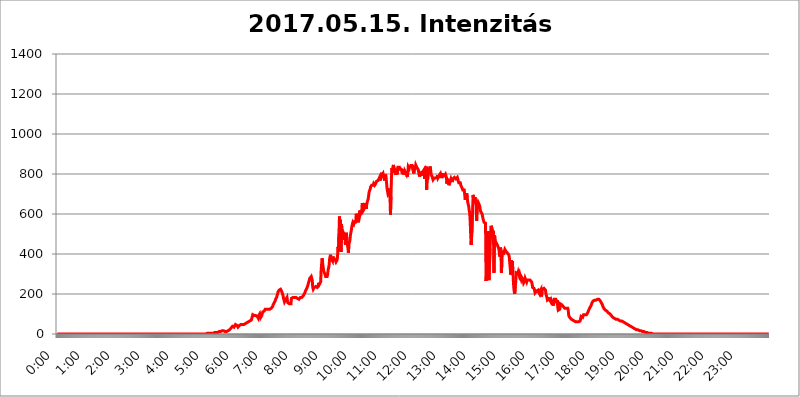
| Category | 2017.05.15. Intenzitás [W/m^2] |
|---|---|
| 0.0 | 0 |
| 0.0006944444444444445 | 0 |
| 0.001388888888888889 | 0 |
| 0.0020833333333333333 | 0 |
| 0.002777777777777778 | 0 |
| 0.003472222222222222 | 0 |
| 0.004166666666666667 | 0 |
| 0.004861111111111111 | 0 |
| 0.005555555555555556 | 0 |
| 0.0062499999999999995 | 0 |
| 0.006944444444444444 | 0 |
| 0.007638888888888889 | 0 |
| 0.008333333333333333 | 0 |
| 0.009027777777777779 | 0 |
| 0.009722222222222222 | 0 |
| 0.010416666666666666 | 0 |
| 0.011111111111111112 | 0 |
| 0.011805555555555555 | 0 |
| 0.012499999999999999 | 0 |
| 0.013194444444444444 | 0 |
| 0.013888888888888888 | 0 |
| 0.014583333333333332 | 0 |
| 0.015277777777777777 | 0 |
| 0.015972222222222224 | 0 |
| 0.016666666666666666 | 0 |
| 0.017361111111111112 | 0 |
| 0.018055555555555557 | 0 |
| 0.01875 | 0 |
| 0.019444444444444445 | 0 |
| 0.02013888888888889 | 0 |
| 0.020833333333333332 | 0 |
| 0.02152777777777778 | 0 |
| 0.022222222222222223 | 0 |
| 0.02291666666666667 | 0 |
| 0.02361111111111111 | 0 |
| 0.024305555555555556 | 0 |
| 0.024999999999999998 | 0 |
| 0.025694444444444447 | 0 |
| 0.02638888888888889 | 0 |
| 0.027083333333333334 | 0 |
| 0.027777777777777776 | 0 |
| 0.02847222222222222 | 0 |
| 0.029166666666666664 | 0 |
| 0.029861111111111113 | 0 |
| 0.030555555555555555 | 0 |
| 0.03125 | 0 |
| 0.03194444444444445 | 0 |
| 0.03263888888888889 | 0 |
| 0.03333333333333333 | 0 |
| 0.034027777777777775 | 0 |
| 0.034722222222222224 | 0 |
| 0.035416666666666666 | 0 |
| 0.036111111111111115 | 0 |
| 0.03680555555555556 | 0 |
| 0.0375 | 0 |
| 0.03819444444444444 | 0 |
| 0.03888888888888889 | 0 |
| 0.03958333333333333 | 0 |
| 0.04027777777777778 | 0 |
| 0.04097222222222222 | 0 |
| 0.041666666666666664 | 0 |
| 0.042361111111111106 | 0 |
| 0.04305555555555556 | 0 |
| 0.043750000000000004 | 0 |
| 0.044444444444444446 | 0 |
| 0.04513888888888889 | 0 |
| 0.04583333333333334 | 0 |
| 0.04652777777777778 | 0 |
| 0.04722222222222222 | 0 |
| 0.04791666666666666 | 0 |
| 0.04861111111111111 | 0 |
| 0.049305555555555554 | 0 |
| 0.049999999999999996 | 0 |
| 0.05069444444444445 | 0 |
| 0.051388888888888894 | 0 |
| 0.052083333333333336 | 0 |
| 0.05277777777777778 | 0 |
| 0.05347222222222222 | 0 |
| 0.05416666666666667 | 0 |
| 0.05486111111111111 | 0 |
| 0.05555555555555555 | 0 |
| 0.05625 | 0 |
| 0.05694444444444444 | 0 |
| 0.057638888888888885 | 0 |
| 0.05833333333333333 | 0 |
| 0.05902777777777778 | 0 |
| 0.059722222222222225 | 0 |
| 0.06041666666666667 | 0 |
| 0.061111111111111116 | 0 |
| 0.06180555555555556 | 0 |
| 0.0625 | 0 |
| 0.06319444444444444 | 0 |
| 0.06388888888888888 | 0 |
| 0.06458333333333334 | 0 |
| 0.06527777777777778 | 0 |
| 0.06597222222222222 | 0 |
| 0.06666666666666667 | 0 |
| 0.06736111111111111 | 0 |
| 0.06805555555555555 | 0 |
| 0.06874999999999999 | 0 |
| 0.06944444444444443 | 0 |
| 0.07013888888888889 | 0 |
| 0.07083333333333333 | 0 |
| 0.07152777777777779 | 0 |
| 0.07222222222222223 | 0 |
| 0.07291666666666667 | 0 |
| 0.07361111111111111 | 0 |
| 0.07430555555555556 | 0 |
| 0.075 | 0 |
| 0.07569444444444444 | 0 |
| 0.0763888888888889 | 0 |
| 0.07708333333333334 | 0 |
| 0.07777777777777778 | 0 |
| 0.07847222222222222 | 0 |
| 0.07916666666666666 | 0 |
| 0.0798611111111111 | 0 |
| 0.08055555555555556 | 0 |
| 0.08125 | 0 |
| 0.08194444444444444 | 0 |
| 0.08263888888888889 | 0 |
| 0.08333333333333333 | 0 |
| 0.08402777777777777 | 0 |
| 0.08472222222222221 | 0 |
| 0.08541666666666665 | 0 |
| 0.08611111111111112 | 0 |
| 0.08680555555555557 | 0 |
| 0.08750000000000001 | 0 |
| 0.08819444444444445 | 0 |
| 0.08888888888888889 | 0 |
| 0.08958333333333333 | 0 |
| 0.09027777777777778 | 0 |
| 0.09097222222222222 | 0 |
| 0.09166666666666667 | 0 |
| 0.09236111111111112 | 0 |
| 0.09305555555555556 | 0 |
| 0.09375 | 0 |
| 0.09444444444444444 | 0 |
| 0.09513888888888888 | 0 |
| 0.09583333333333333 | 0 |
| 0.09652777777777777 | 0 |
| 0.09722222222222222 | 0 |
| 0.09791666666666667 | 0 |
| 0.09861111111111111 | 0 |
| 0.09930555555555555 | 0 |
| 0.09999999999999999 | 0 |
| 0.10069444444444443 | 0 |
| 0.1013888888888889 | 0 |
| 0.10208333333333335 | 0 |
| 0.10277777777777779 | 0 |
| 0.10347222222222223 | 0 |
| 0.10416666666666667 | 0 |
| 0.10486111111111111 | 0 |
| 0.10555555555555556 | 0 |
| 0.10625 | 0 |
| 0.10694444444444444 | 0 |
| 0.1076388888888889 | 0 |
| 0.10833333333333334 | 0 |
| 0.10902777777777778 | 0 |
| 0.10972222222222222 | 0 |
| 0.1111111111111111 | 0 |
| 0.11180555555555556 | 0 |
| 0.11180555555555556 | 0 |
| 0.1125 | 0 |
| 0.11319444444444444 | 0 |
| 0.11388888888888889 | 0 |
| 0.11458333333333333 | 0 |
| 0.11527777777777777 | 0 |
| 0.11597222222222221 | 0 |
| 0.11666666666666665 | 0 |
| 0.1173611111111111 | 0 |
| 0.11805555555555557 | 0 |
| 0.11944444444444445 | 0 |
| 0.12013888888888889 | 0 |
| 0.12083333333333333 | 0 |
| 0.12152777777777778 | 0 |
| 0.12222222222222223 | 0 |
| 0.12291666666666667 | 0 |
| 0.12291666666666667 | 0 |
| 0.12361111111111112 | 0 |
| 0.12430555555555556 | 0 |
| 0.125 | 0 |
| 0.12569444444444444 | 0 |
| 0.12638888888888888 | 0 |
| 0.12708333333333333 | 0 |
| 0.16875 | 0 |
| 0.12847222222222224 | 0 |
| 0.12916666666666668 | 0 |
| 0.12986111111111112 | 0 |
| 0.13055555555555556 | 0 |
| 0.13125 | 0 |
| 0.13194444444444445 | 0 |
| 0.1326388888888889 | 0 |
| 0.13333333333333333 | 0 |
| 0.13402777777777777 | 0 |
| 0.13402777777777777 | 0 |
| 0.13472222222222222 | 0 |
| 0.13541666666666666 | 0 |
| 0.1361111111111111 | 0 |
| 0.13749999999999998 | 0 |
| 0.13819444444444443 | 0 |
| 0.1388888888888889 | 0 |
| 0.13958333333333334 | 0 |
| 0.14027777777777778 | 0 |
| 0.14097222222222222 | 0 |
| 0.14166666666666666 | 0 |
| 0.1423611111111111 | 0 |
| 0.14305555555555557 | 0 |
| 0.14375000000000002 | 0 |
| 0.14444444444444446 | 0 |
| 0.1451388888888889 | 0 |
| 0.1451388888888889 | 0 |
| 0.14652777777777778 | 0 |
| 0.14722222222222223 | 0 |
| 0.14791666666666667 | 0 |
| 0.1486111111111111 | 0 |
| 0.14930555555555555 | 0 |
| 0.15 | 0 |
| 0.15069444444444444 | 0 |
| 0.15138888888888888 | 0 |
| 0.15208333333333332 | 0 |
| 0.15277777777777776 | 0 |
| 0.15347222222222223 | 0 |
| 0.15416666666666667 | 0 |
| 0.15486111111111112 | 0 |
| 0.15555555555555556 | 0 |
| 0.15625 | 0 |
| 0.15694444444444444 | 0 |
| 0.15763888888888888 | 0 |
| 0.15833333333333333 | 0 |
| 0.15902777777777777 | 0 |
| 0.15972222222222224 | 0 |
| 0.16041666666666668 | 0 |
| 0.16111111111111112 | 0 |
| 0.16180555555555556 | 0 |
| 0.1625 | 0 |
| 0.16319444444444445 | 0 |
| 0.1638888888888889 | 0 |
| 0.16458333333333333 | 0 |
| 0.16527777777777777 | 0 |
| 0.16597222222222222 | 0 |
| 0.16666666666666666 | 0 |
| 0.1673611111111111 | 0 |
| 0.16805555555555554 | 0 |
| 0.16874999999999998 | 0 |
| 0.16944444444444443 | 0 |
| 0.17013888888888887 | 0 |
| 0.1708333333333333 | 0 |
| 0.17152777777777775 | 0 |
| 0.17222222222222225 | 0 |
| 0.1729166666666667 | 0 |
| 0.17361111111111113 | 0 |
| 0.17430555555555557 | 0 |
| 0.17500000000000002 | 0 |
| 0.17569444444444446 | 0 |
| 0.1763888888888889 | 0 |
| 0.17708333333333334 | 0 |
| 0.17777777777777778 | 0 |
| 0.17847222222222223 | 0 |
| 0.17916666666666667 | 0 |
| 0.1798611111111111 | 0 |
| 0.18055555555555555 | 0 |
| 0.18125 | 0 |
| 0.18194444444444444 | 0 |
| 0.1826388888888889 | 0 |
| 0.18333333333333335 | 0 |
| 0.1840277777777778 | 0 |
| 0.18472222222222223 | 0 |
| 0.18541666666666667 | 0 |
| 0.18611111111111112 | 0 |
| 0.18680555555555556 | 0 |
| 0.1875 | 0 |
| 0.18819444444444444 | 0 |
| 0.18888888888888888 | 0 |
| 0.18958333333333333 | 0 |
| 0.19027777777777777 | 0 |
| 0.1909722222222222 | 0 |
| 0.19166666666666665 | 0 |
| 0.19236111111111112 | 0 |
| 0.19305555555555554 | 0 |
| 0.19375 | 0 |
| 0.19444444444444445 | 0 |
| 0.1951388888888889 | 0 |
| 0.19583333333333333 | 0 |
| 0.19652777777777777 | 0 |
| 0.19722222222222222 | 0 |
| 0.19791666666666666 | 0 |
| 0.1986111111111111 | 0 |
| 0.19930555555555554 | 0 |
| 0.19999999999999998 | 0 |
| 0.20069444444444443 | 0 |
| 0.20138888888888887 | 0 |
| 0.2020833333333333 | 0 |
| 0.2027777777777778 | 0 |
| 0.2034722222222222 | 0 |
| 0.2041666666666667 | 0 |
| 0.20486111111111113 | 0 |
| 0.20555555555555557 | 0 |
| 0.20625000000000002 | 0 |
| 0.20694444444444446 | 0 |
| 0.2076388888888889 | 0 |
| 0.20833333333333334 | 0 |
| 0.20902777777777778 | 3.525 |
| 0.20972222222222223 | 3.525 |
| 0.21041666666666667 | 3.525 |
| 0.2111111111111111 | 3.525 |
| 0.21180555555555555 | 3.525 |
| 0.2125 | 3.525 |
| 0.21319444444444444 | 3.525 |
| 0.2138888888888889 | 3.525 |
| 0.21458333333333335 | 3.525 |
| 0.2152777777777778 | 3.525 |
| 0.21597222222222223 | 3.525 |
| 0.21666666666666667 | 3.525 |
| 0.21736111111111112 | 3.525 |
| 0.21805555555555556 | 3.525 |
| 0.21875 | 3.525 |
| 0.21944444444444444 | 7.887 |
| 0.22013888888888888 | 7.887 |
| 0.22083333333333333 | 7.887 |
| 0.22152777777777777 | 7.887 |
| 0.2222222222222222 | 7.887 |
| 0.22291666666666665 | 7.887 |
| 0.2236111111111111 | 7.887 |
| 0.22430555555555556 | 7.887 |
| 0.225 | 7.887 |
| 0.22569444444444445 | 7.887 |
| 0.2263888888888889 | 12.257 |
| 0.22708333333333333 | 12.257 |
| 0.22777777777777777 | 12.257 |
| 0.22847222222222222 | 12.257 |
| 0.22916666666666666 | 12.257 |
| 0.2298611111111111 | 16.636 |
| 0.23055555555555554 | 16.636 |
| 0.23124999999999998 | 16.636 |
| 0.23194444444444443 | 16.636 |
| 0.23263888888888887 | 16.636 |
| 0.2333333333333333 | 16.636 |
| 0.2340277777777778 | 16.636 |
| 0.2347222222222222 | 12.257 |
| 0.2354166666666667 | 12.257 |
| 0.23611111111111113 | 12.257 |
| 0.23680555555555557 | 12.257 |
| 0.23750000000000002 | 12.257 |
| 0.23819444444444446 | 12.257 |
| 0.2388888888888889 | 16.636 |
| 0.23958333333333334 | 16.636 |
| 0.24027777777777778 | 16.636 |
| 0.24097222222222223 | 21.024 |
| 0.24166666666666667 | 21.024 |
| 0.2423611111111111 | 25.419 |
| 0.24305555555555555 | 25.419 |
| 0.24375 | 29.823 |
| 0.24444444444444446 | 29.823 |
| 0.24513888888888888 | 34.234 |
| 0.24583333333333335 | 38.653 |
| 0.2465277777777778 | 34.234 |
| 0.24722222222222223 | 34.234 |
| 0.24791666666666667 | 34.234 |
| 0.24861111111111112 | 34.234 |
| 0.24930555555555556 | 38.653 |
| 0.25 | 47.511 |
| 0.25069444444444444 | 47.511 |
| 0.2513888888888889 | 47.511 |
| 0.2520833333333333 | 43.079 |
| 0.25277777777777777 | 38.653 |
| 0.2534722222222222 | 34.234 |
| 0.25416666666666665 | 38.653 |
| 0.2548611111111111 | 38.653 |
| 0.2555555555555556 | 43.079 |
| 0.25625000000000003 | 47.511 |
| 0.2569444444444445 | 47.511 |
| 0.2576388888888889 | 47.511 |
| 0.25833333333333336 | 47.511 |
| 0.2590277777777778 | 47.511 |
| 0.25972222222222224 | 47.511 |
| 0.2604166666666667 | 47.511 |
| 0.2611111111111111 | 47.511 |
| 0.26180555555555557 | 47.511 |
| 0.2625 | 47.511 |
| 0.26319444444444445 | 51.951 |
| 0.2638888888888889 | 51.951 |
| 0.26458333333333334 | 51.951 |
| 0.2652777777777778 | 51.951 |
| 0.2659722222222222 | 56.398 |
| 0.26666666666666666 | 56.398 |
| 0.2673611111111111 | 56.398 |
| 0.26805555555555555 | 60.85 |
| 0.26875 | 60.85 |
| 0.26944444444444443 | 65.31 |
| 0.2701388888888889 | 65.31 |
| 0.2708333333333333 | 69.775 |
| 0.27152777777777776 | 69.775 |
| 0.2722222222222222 | 69.775 |
| 0.27291666666666664 | 69.775 |
| 0.2736111111111111 | 87.692 |
| 0.2743055555555555 | 96.682 |
| 0.27499999999999997 | 92.184 |
| 0.27569444444444446 | 96.682 |
| 0.27638888888888885 | 92.184 |
| 0.27708333333333335 | 92.184 |
| 0.2777777777777778 | 92.184 |
| 0.27847222222222223 | 92.184 |
| 0.2791666666666667 | 92.184 |
| 0.2798611111111111 | 96.682 |
| 0.28055555555555556 | 87.692 |
| 0.28125 | 92.184 |
| 0.28194444444444444 | 78.722 |
| 0.2826388888888889 | 92.184 |
| 0.2833333333333333 | 96.682 |
| 0.28402777777777777 | 101.184 |
| 0.2847222222222222 | 96.682 |
| 0.28541666666666665 | 83.205 |
| 0.28611111111111115 | 83.205 |
| 0.28680555555555554 | 92.184 |
| 0.28750000000000003 | 101.184 |
| 0.2881944444444445 | 110.201 |
| 0.2888888888888889 | 110.201 |
| 0.28958333333333336 | 114.716 |
| 0.2902777777777778 | 114.716 |
| 0.29097222222222224 | 119.235 |
| 0.2916666666666667 | 123.758 |
| 0.2923611111111111 | 123.758 |
| 0.29305555555555557 | 123.758 |
| 0.29375 | 123.758 |
| 0.29444444444444445 | 123.758 |
| 0.2951388888888889 | 123.758 |
| 0.29583333333333334 | 123.758 |
| 0.2965277777777778 | 123.758 |
| 0.2972222222222222 | 123.758 |
| 0.29791666666666666 | 123.758 |
| 0.2986111111111111 | 123.758 |
| 0.29930555555555555 | 128.284 |
| 0.3 | 128.284 |
| 0.30069444444444443 | 128.284 |
| 0.3013888888888889 | 132.814 |
| 0.3020833333333333 | 137.347 |
| 0.30277777777777776 | 146.423 |
| 0.3034722222222222 | 150.964 |
| 0.30416666666666664 | 155.509 |
| 0.3048611111111111 | 160.056 |
| 0.3055555555555555 | 164.605 |
| 0.30624999999999997 | 173.709 |
| 0.3069444444444444 | 178.264 |
| 0.3076388888888889 | 182.82 |
| 0.30833333333333335 | 191.937 |
| 0.3090277777777778 | 201.058 |
| 0.30972222222222223 | 210.182 |
| 0.3104166666666667 | 214.746 |
| 0.3111111111111111 | 219.309 |
| 0.31180555555555556 | 219.309 |
| 0.3125 | 223.873 |
| 0.31319444444444444 | 223.873 |
| 0.3138888888888889 | 219.309 |
| 0.3145833333333333 | 214.746 |
| 0.31527777777777777 | 210.182 |
| 0.3159722222222222 | 201.058 |
| 0.31666666666666665 | 191.937 |
| 0.31736111111111115 | 178.264 |
| 0.31805555555555554 | 178.264 |
| 0.31875000000000003 | 160.056 |
| 0.3194444444444445 | 160.056 |
| 0.3201388888888889 | 164.605 |
| 0.32083333333333336 | 173.709 |
| 0.3215277777777778 | 173.709 |
| 0.32222222222222224 | 182.82 |
| 0.3229166666666667 | 164.605 |
| 0.3236111111111111 | 155.509 |
| 0.32430555555555557 | 150.964 |
| 0.325 | 150.964 |
| 0.32569444444444445 | 150.964 |
| 0.3263888888888889 | 146.423 |
| 0.32708333333333334 | 146.423 |
| 0.3277777777777778 | 150.964 |
| 0.3284722222222222 | 178.264 |
| 0.32916666666666666 | 182.82 |
| 0.3298611111111111 | 182.82 |
| 0.33055555555555555 | 182.82 |
| 0.33125 | 182.82 |
| 0.33194444444444443 | 182.82 |
| 0.3326388888888889 | 182.82 |
| 0.3333333333333333 | 182.82 |
| 0.3340277777777778 | 182.82 |
| 0.3347222222222222 | 182.82 |
| 0.3354166666666667 | 182.82 |
| 0.3361111111111111 | 182.82 |
| 0.3368055555555556 | 178.264 |
| 0.33749999999999997 | 178.264 |
| 0.33819444444444446 | 178.264 |
| 0.33888888888888885 | 173.709 |
| 0.33958333333333335 | 178.264 |
| 0.34027777777777773 | 178.264 |
| 0.34097222222222223 | 182.82 |
| 0.3416666666666666 | 182.82 |
| 0.3423611111111111 | 182.82 |
| 0.3430555555555555 | 182.82 |
| 0.34375 | 182.82 |
| 0.3444444444444445 | 187.378 |
| 0.3451388888888889 | 191.937 |
| 0.3458333333333334 | 196.497 |
| 0.34652777777777777 | 196.497 |
| 0.34722222222222227 | 205.62 |
| 0.34791666666666665 | 210.182 |
| 0.34861111111111115 | 219.309 |
| 0.34930555555555554 | 223.873 |
| 0.35000000000000003 | 228.436 |
| 0.3506944444444444 | 233 |
| 0.3513888888888889 | 242.127 |
| 0.3520833333333333 | 251.251 |
| 0.3527777777777778 | 260.373 |
| 0.3534722222222222 | 269.49 |
| 0.3541666666666667 | 278.603 |
| 0.3548611111111111 | 283.156 |
| 0.35555555555555557 | 283.156 |
| 0.35625 | 287.709 |
| 0.35694444444444445 | 292.259 |
| 0.3576388888888889 | 269.49 |
| 0.35833333333333334 | 233 |
| 0.3590277777777778 | 223.873 |
| 0.3597222222222222 | 228.436 |
| 0.36041666666666666 | 233 |
| 0.3611111111111111 | 237.564 |
| 0.36180555555555555 | 237.564 |
| 0.3625 | 237.564 |
| 0.36319444444444443 | 233 |
| 0.3638888888888889 | 233 |
| 0.3645833333333333 | 233 |
| 0.3652777777777778 | 237.564 |
| 0.3659722222222222 | 242.127 |
| 0.3666666666666667 | 255.813 |
| 0.3673611111111111 | 246.689 |
| 0.3680555555555556 | 246.689 |
| 0.36874999999999997 | 251.251 |
| 0.36944444444444446 | 260.373 |
| 0.37013888888888885 | 319.517 |
| 0.37083333333333335 | 351.198 |
| 0.37152777777777773 | 378.224 |
| 0.37222222222222223 | 355.712 |
| 0.3729166666666666 | 351.198 |
| 0.3736111111111111 | 314.98 |
| 0.3743055555555555 | 310.44 |
| 0.375 | 319.517 |
| 0.3756944444444445 | 296.808 |
| 0.3763888888888889 | 287.709 |
| 0.3770833333333334 | 283.156 |
| 0.37777777777777777 | 283.156 |
| 0.37847222222222227 | 287.709 |
| 0.37916666666666665 | 296.808 |
| 0.37986111111111115 | 319.517 |
| 0.38055555555555554 | 324.052 |
| 0.38125000000000003 | 342.162 |
| 0.3819444444444444 | 373.729 |
| 0.3826388888888889 | 387.202 |
| 0.3833333333333333 | 396.164 |
| 0.3840277777777778 | 378.224 |
| 0.3847222222222222 | 378.224 |
| 0.3854166666666667 | 373.729 |
| 0.3861111111111111 | 364.728 |
| 0.38680555555555557 | 387.202 |
| 0.3875 | 378.224 |
| 0.38819444444444445 | 378.224 |
| 0.3888888888888889 | 373.729 |
| 0.38958333333333334 | 373.729 |
| 0.3902777777777778 | 369.23 |
| 0.3909722222222222 | 360.221 |
| 0.39166666666666666 | 360.221 |
| 0.3923611111111111 | 369.23 |
| 0.39305555555555555 | 382.715 |
| 0.39375 | 436.27 |
| 0.39444444444444443 | 418.492 |
| 0.3951388888888889 | 502.192 |
| 0.3958333333333333 | 588.009 |
| 0.3965277777777778 | 515.223 |
| 0.3972222222222222 | 571.049 |
| 0.3979166666666667 | 409.574 |
| 0.3986111111111111 | 549.704 |
| 0.3993055555555556 | 519.555 |
| 0.39999999999999997 | 471.582 |
| 0.40069444444444446 | 471.582 |
| 0.40138888888888885 | 506.542 |
| 0.40208333333333335 | 510.885 |
| 0.40277777777777773 | 497.836 |
| 0.40347222222222223 | 489.108 |
| 0.4041666666666666 | 445.129 |
| 0.4048611111111111 | 484.735 |
| 0.4055555555555555 | 506.542 |
| 0.40625 | 458.38 |
| 0.4069444444444445 | 453.968 |
| 0.4076388888888889 | 431.833 |
| 0.4083333333333334 | 405.108 |
| 0.40902777777777777 | 449.551 |
| 0.40972222222222227 | 445.129 |
| 0.41041666666666665 | 467.187 |
| 0.41111111111111115 | 493.475 |
| 0.41180555555555554 | 493.475 |
| 0.41250000000000003 | 519.555 |
| 0.4131944444444444 | 536.82 |
| 0.4138888888888889 | 549.704 |
| 0.4145833333333333 | 558.261 |
| 0.4152777777777778 | 553.986 |
| 0.4159722222222222 | 549.704 |
| 0.4166666666666667 | 549.704 |
| 0.4173611111111111 | 566.793 |
| 0.41805555555555557 | 553.986 |
| 0.41875 | 566.793 |
| 0.41944444444444445 | 600.661 |
| 0.4201388888888889 | 562.53 |
| 0.42083333333333334 | 600.661 |
| 0.4215277777777778 | 566.793 |
| 0.4222222222222222 | 558.261 |
| 0.42291666666666666 | 571.049 |
| 0.4236111111111111 | 579.542 |
| 0.42430555555555555 | 617.436 |
| 0.425 | 596.45 |
| 0.42569444444444443 | 600.661 |
| 0.4263888888888889 | 600.661 |
| 0.4270833333333333 | 613.252 |
| 0.4277777777777778 | 654.791 |
| 0.4284722222222222 | 642.4 |
| 0.4291666666666667 | 617.436 |
| 0.4298611111111111 | 613.252 |
| 0.4305555555555556 | 625.784 |
| 0.43124999999999997 | 629.948 |
| 0.43194444444444446 | 654.791 |
| 0.43263888888888885 | 650.667 |
| 0.43333333333333335 | 625.784 |
| 0.43402777777777773 | 650.667 |
| 0.43472222222222223 | 658.909 |
| 0.4354166666666666 | 667.123 |
| 0.4361111111111111 | 675.311 |
| 0.4368055555555555 | 679.395 |
| 0.4375 | 711.832 |
| 0.4381944444444445 | 715.858 |
| 0.4388888888888889 | 723.889 |
| 0.4395833333333334 | 735.89 |
| 0.44027777777777777 | 735.89 |
| 0.44097222222222227 | 743.859 |
| 0.44166666666666665 | 739.877 |
| 0.44236111111111115 | 747.834 |
| 0.44305555555555554 | 743.859 |
| 0.44375000000000003 | 751.803 |
| 0.4444444444444444 | 747.834 |
| 0.4451388888888889 | 743.859 |
| 0.4458333333333333 | 747.834 |
| 0.4465277777777778 | 751.803 |
| 0.4472222222222222 | 755.766 |
| 0.4479166666666667 | 763.674 |
| 0.4486111111111111 | 763.674 |
| 0.44930555555555557 | 759.723 |
| 0.45 | 767.62 |
| 0.45069444444444445 | 771.559 |
| 0.4513888888888889 | 771.559 |
| 0.45208333333333334 | 783.342 |
| 0.4527777777777778 | 767.62 |
| 0.4534722222222222 | 763.674 |
| 0.45416666666666666 | 787.258 |
| 0.4548611111111111 | 806.757 |
| 0.45555555555555555 | 795.074 |
| 0.45625 | 791.169 |
| 0.45694444444444443 | 802.868 |
| 0.4576388888888889 | 806.757 |
| 0.4583333333333333 | 806.757 |
| 0.4590277777777778 | 767.62 |
| 0.4597222222222222 | 798.974 |
| 0.4604166666666667 | 798.974 |
| 0.4611111111111111 | 787.258 |
| 0.4618055555555556 | 759.723 |
| 0.46249999999999997 | 727.896 |
| 0.46319444444444446 | 727.896 |
| 0.46388888888888885 | 699.717 |
| 0.46458333333333335 | 703.762 |
| 0.46527777777777773 | 707.8 |
| 0.46597222222222223 | 727.896 |
| 0.4666666666666666 | 683.473 |
| 0.4673611111111111 | 596.45 |
| 0.4680555555555555 | 687.544 |
| 0.46875 | 783.342 |
| 0.4694444444444445 | 829.981 |
| 0.4701388888888889 | 806.757 |
| 0.4708333333333334 | 810.641 |
| 0.47152777777777777 | 845.365 |
| 0.47222222222222227 | 829.981 |
| 0.47291666666666665 | 826.123 |
| 0.47361111111111115 | 822.26 |
| 0.47430555555555554 | 810.641 |
| 0.47500000000000003 | 795.074 |
| 0.4756944444444444 | 822.26 |
| 0.4763888888888889 | 826.123 |
| 0.4770833333333333 | 798.974 |
| 0.4777777777777778 | 833.834 |
| 0.4784722222222222 | 829.981 |
| 0.4791666666666667 | 829.981 |
| 0.4798611111111111 | 833.834 |
| 0.48055555555555557 | 822.26 |
| 0.48125 | 829.981 |
| 0.48194444444444445 | 818.392 |
| 0.4826388888888889 | 826.123 |
| 0.48333333333333334 | 814.519 |
| 0.4840277777777778 | 798.974 |
| 0.4847222222222222 | 802.868 |
| 0.48541666666666666 | 814.519 |
| 0.4861111111111111 | 822.26 |
| 0.48680555555555555 | 795.074 |
| 0.4875 | 814.519 |
| 0.48819444444444443 | 814.519 |
| 0.4888888888888889 | 810.641 |
| 0.4895833333333333 | 798.974 |
| 0.4902777777777778 | 814.519 |
| 0.4909722222222222 | 787.258 |
| 0.4916666666666667 | 802.868 |
| 0.4923611111111111 | 837.682 |
| 0.4930555555555556 | 833.834 |
| 0.49374999999999997 | 829.981 |
| 0.49444444444444446 | 841.526 |
| 0.49513888888888885 | 829.981 |
| 0.49583333333333335 | 837.682 |
| 0.49652777777777773 | 849.199 |
| 0.49722222222222223 | 837.682 |
| 0.4979166666666666 | 845.365 |
| 0.4986111111111111 | 845.365 |
| 0.4993055555555555 | 841.526 |
| 0.5 | 802.868 |
| 0.5006944444444444 | 818.392 |
| 0.5013888888888889 | 818.392 |
| 0.5020833333333333 | 829.981 |
| 0.5027777777777778 | 845.365 |
| 0.5034722222222222 | 845.365 |
| 0.5041666666666667 | 833.834 |
| 0.5048611111111111 | 833.834 |
| 0.5055555555555555 | 829.981 |
| 0.50625 | 822.26 |
| 0.5069444444444444 | 818.392 |
| 0.5076388888888889 | 795.074 |
| 0.5083333333333333 | 787.258 |
| 0.5090277777777777 | 791.169 |
| 0.5097222222222222 | 810.641 |
| 0.5104166666666666 | 791.169 |
| 0.5111111111111112 | 806.757 |
| 0.5118055555555555 | 814.519 |
| 0.5125000000000001 | 798.974 |
| 0.5131944444444444 | 814.519 |
| 0.513888888888889 | 810.641 |
| 0.5145833333333333 | 822.26 |
| 0.5152777777777778 | 775.492 |
| 0.5159722222222222 | 814.519 |
| 0.5166666666666667 | 810.641 |
| 0.517361111111111 | 837.682 |
| 0.5180555555555556 | 719.877 |
| 0.5187499999999999 | 787.258 |
| 0.5194444444444445 | 771.559 |
| 0.5201388888888888 | 767.62 |
| 0.5208333333333334 | 829.981 |
| 0.5215277777777778 | 810.641 |
| 0.5222222222222223 | 829.981 |
| 0.5229166666666667 | 837.682 |
| 0.5236111111111111 | 822.26 |
| 0.5243055555555556 | 798.974 |
| 0.525 | 802.868 |
| 0.5256944444444445 | 787.258 |
| 0.5263888888888889 | 783.342 |
| 0.5270833333333333 | 771.559 |
| 0.5277777777777778 | 767.62 |
| 0.5284722222222222 | 779.42 |
| 0.5291666666666667 | 783.342 |
| 0.5298611111111111 | 775.492 |
| 0.5305555555555556 | 779.42 |
| 0.53125 | 775.492 |
| 0.5319444444444444 | 783.342 |
| 0.5326388888888889 | 783.342 |
| 0.5333333333333333 | 795.074 |
| 0.5340277777777778 | 779.42 |
| 0.5347222222222222 | 779.42 |
| 0.5354166666666667 | 787.258 |
| 0.5361111111111111 | 795.074 |
| 0.5368055555555555 | 791.169 |
| 0.5375 | 802.868 |
| 0.5381944444444444 | 795.074 |
| 0.5388888888888889 | 795.074 |
| 0.5395833333333333 | 779.42 |
| 0.5402777777777777 | 802.868 |
| 0.5409722222222222 | 795.074 |
| 0.5416666666666666 | 791.169 |
| 0.5423611111111112 | 791.169 |
| 0.5430555555555555 | 791.169 |
| 0.5437500000000001 | 795.074 |
| 0.5444444444444444 | 798.974 |
| 0.545138888888889 | 791.169 |
| 0.5458333333333333 | 783.342 |
| 0.5465277777777778 | 751.803 |
| 0.5472222222222222 | 775.492 |
| 0.5479166666666667 | 779.42 |
| 0.548611111111111 | 763.674 |
| 0.5493055555555556 | 743.859 |
| 0.5499999999999999 | 747.834 |
| 0.5506944444444445 | 747.834 |
| 0.5513888888888888 | 767.62 |
| 0.5520833333333334 | 775.492 |
| 0.5527777777777778 | 767.62 |
| 0.5534722222222223 | 779.42 |
| 0.5541666666666667 | 759.723 |
| 0.5548611111111111 | 775.492 |
| 0.5555555555555556 | 779.42 |
| 0.55625 | 779.42 |
| 0.5569444444444445 | 783.342 |
| 0.5576388888888889 | 783.342 |
| 0.5583333333333333 | 783.342 |
| 0.5590277777777778 | 775.492 |
| 0.5597222222222222 | 779.42 |
| 0.5604166666666667 | 775.492 |
| 0.5611111111111111 | 783.342 |
| 0.5618055555555556 | 775.492 |
| 0.5625 | 763.674 |
| 0.5631944444444444 | 755.766 |
| 0.5638888888888889 | 759.723 |
| 0.5645833333333333 | 759.723 |
| 0.5652777777777778 | 755.766 |
| 0.5659722222222222 | 743.859 |
| 0.5666666666666667 | 743.859 |
| 0.5673611111111111 | 739.877 |
| 0.5680555555555555 | 727.896 |
| 0.56875 | 719.877 |
| 0.5694444444444444 | 719.877 |
| 0.5701388888888889 | 723.889 |
| 0.5708333333333333 | 719.877 |
| 0.5715277777777777 | 715.858 |
| 0.5722222222222222 | 671.22 |
| 0.5729166666666666 | 687.544 |
| 0.5736111111111112 | 691.608 |
| 0.5743055555555555 | 703.762 |
| 0.5750000000000001 | 683.473 |
| 0.5756944444444444 | 658.909 |
| 0.576388888888889 | 663.019 |
| 0.5770833333333333 | 638.256 |
| 0.5777777777777778 | 617.436 |
| 0.5784722222222222 | 604.864 |
| 0.5791666666666667 | 562.53 |
| 0.579861111111111 | 497.836 |
| 0.5805555555555556 | 445.129 |
| 0.5812499999999999 | 493.475 |
| 0.5819444444444445 | 515.223 |
| 0.5826388888888888 | 634.105 |
| 0.5833333333333334 | 695.666 |
| 0.5840277777777778 | 663.019 |
| 0.5847222222222223 | 654.791 |
| 0.5854166666666667 | 667.123 |
| 0.5861111111111111 | 683.473 |
| 0.5868055555555556 | 654.791 |
| 0.5875 | 642.4 |
| 0.5881944444444445 | 566.793 |
| 0.5888888888888889 | 634.105 |
| 0.5895833333333333 | 650.667 |
| 0.5902777777777778 | 658.909 |
| 0.5909722222222222 | 654.791 |
| 0.5916666666666667 | 654.791 |
| 0.5923611111111111 | 642.4 |
| 0.5930555555555556 | 638.256 |
| 0.59375 | 613.252 |
| 0.5944444444444444 | 609.062 |
| 0.5951388888888889 | 609.062 |
| 0.5958333333333333 | 600.661 |
| 0.5965277777777778 | 596.45 |
| 0.5972222222222222 | 575.299 |
| 0.5979166666666667 | 579.542 |
| 0.5986111111111111 | 558.261 |
| 0.5993055555555555 | 553.986 |
| 0.6 | 562.53 |
| 0.6006944444444444 | 553.986 |
| 0.6013888888888889 | 264.932 |
| 0.6020833333333333 | 296.808 |
| 0.6027777777777777 | 269.49 |
| 0.6034722222222222 | 337.639 |
| 0.6041666666666666 | 515.223 |
| 0.6048611111111112 | 310.44 |
| 0.6055555555555555 | 269.49 |
| 0.6062500000000001 | 264.932 |
| 0.6069444444444444 | 427.39 |
| 0.607638888888889 | 484.735 |
| 0.6083333333333333 | 541.121 |
| 0.6090277777777778 | 536.82 |
| 0.6097222222222222 | 528.2 |
| 0.6104166666666667 | 519.555 |
| 0.611111111111111 | 515.223 |
| 0.6118055555555556 | 510.885 |
| 0.6124999999999999 | 305.898 |
| 0.6131944444444445 | 493.475 |
| 0.6138888888888888 | 480.356 |
| 0.6145833333333334 | 462.786 |
| 0.6152777777777778 | 458.38 |
| 0.6159722222222223 | 462.786 |
| 0.6166666666666667 | 449.551 |
| 0.6173611111111111 | 449.551 |
| 0.6180555555555556 | 449.551 |
| 0.61875 | 431.833 |
| 0.6194444444444445 | 422.943 |
| 0.6201388888888889 | 405.108 |
| 0.6208333333333333 | 387.202 |
| 0.6215277777777778 | 431.833 |
| 0.6222222222222222 | 422.943 |
| 0.6229166666666667 | 305.898 |
| 0.6236111111111111 | 360.221 |
| 0.6243055555555556 | 409.574 |
| 0.625 | 409.574 |
| 0.6256944444444444 | 409.574 |
| 0.6263888888888889 | 405.108 |
| 0.6270833333333333 | 409.574 |
| 0.6277777777777778 | 422.943 |
| 0.6284722222222222 | 422.943 |
| 0.6291666666666667 | 414.035 |
| 0.6298611111111111 | 414.035 |
| 0.6305555555555555 | 409.574 |
| 0.63125 | 405.108 |
| 0.6319444444444444 | 400.638 |
| 0.6326388888888889 | 400.638 |
| 0.6333333333333333 | 396.164 |
| 0.6340277777777777 | 382.715 |
| 0.6347222222222222 | 382.715 |
| 0.6354166666666666 | 378.224 |
| 0.6361111111111112 | 296.808 |
| 0.6368055555555555 | 369.23 |
| 0.6375000000000001 | 328.584 |
| 0.6381944444444444 | 364.728 |
| 0.638888888888889 | 324.052 |
| 0.6395833333333333 | 274.047 |
| 0.6402777777777778 | 233 |
| 0.6409722222222222 | 210.182 |
| 0.6416666666666667 | 201.058 |
| 0.642361111111111 | 237.564 |
| 0.6430555555555556 | 260.373 |
| 0.6437499999999999 | 305.898 |
| 0.6444444444444445 | 305.898 |
| 0.6451388888888888 | 310.44 |
| 0.6458333333333334 | 301.354 |
| 0.6465277777777778 | 310.44 |
| 0.6472222222222223 | 305.898 |
| 0.6479166666666667 | 292.259 |
| 0.6486111111111111 | 301.354 |
| 0.6493055555555556 | 305.898 |
| 0.65 | 283.156 |
| 0.6506944444444445 | 274.047 |
| 0.6513888888888889 | 283.156 |
| 0.6520833333333333 | 283.156 |
| 0.6527777777777778 | 287.709 |
| 0.6534722222222222 | 269.49 |
| 0.6541666666666667 | 255.813 |
| 0.6548611111111111 | 260.373 |
| 0.6555555555555556 | 264.932 |
| 0.65625 | 278.603 |
| 0.6569444444444444 | 283.156 |
| 0.6576388888888889 | 278.603 |
| 0.6583333333333333 | 260.373 |
| 0.6590277777777778 | 269.49 |
| 0.6597222222222222 | 274.047 |
| 0.6604166666666667 | 264.932 |
| 0.6611111111111111 | 269.49 |
| 0.6618055555555555 | 274.047 |
| 0.6625 | 269.49 |
| 0.6631944444444444 | 269.49 |
| 0.6638888888888889 | 264.932 |
| 0.6645833333333333 | 264.932 |
| 0.6652777777777777 | 260.373 |
| 0.6659722222222222 | 251.251 |
| 0.6666666666666666 | 233 |
| 0.6673611111111111 | 233 |
| 0.6680555555555556 | 228.436 |
| 0.6687500000000001 | 228.436 |
| 0.6694444444444444 | 219.309 |
| 0.6701388888888888 | 205.62 |
| 0.6708333333333334 | 210.182 |
| 0.6715277777777778 | 205.62 |
| 0.6722222222222222 | 214.746 |
| 0.6729166666666666 | 210.182 |
| 0.6736111111111112 | 219.309 |
| 0.6743055555555556 | 219.309 |
| 0.6749999999999999 | 210.182 |
| 0.6756944444444444 | 210.182 |
| 0.6763888888888889 | 201.058 |
| 0.6770833333333334 | 214.746 |
| 0.6777777777777777 | 219.309 |
| 0.6784722222222223 | 223.873 |
| 0.6791666666666667 | 187.378 |
| 0.6798611111111111 | 210.182 |
| 0.6805555555555555 | 223.873 |
| 0.68125 | 223.873 |
| 0.6819444444444445 | 228.436 |
| 0.6826388888888889 | 228.436 |
| 0.6833333333333332 | 223.873 |
| 0.6840277777777778 | 223.873 |
| 0.6847222222222222 | 219.309 |
| 0.6854166666666667 | 201.058 |
| 0.686111111111111 | 196.497 |
| 0.6868055555555556 | 182.82 |
| 0.6875 | 169.156 |
| 0.6881944444444444 | 169.156 |
| 0.688888888888889 | 164.605 |
| 0.6895833333333333 | 173.709 |
| 0.6902777777777778 | 182.82 |
| 0.6909722222222222 | 169.156 |
| 0.6916666666666668 | 169.156 |
| 0.6923611111111111 | 160.056 |
| 0.6930555555555555 | 169.156 |
| 0.69375 | 164.605 |
| 0.6944444444444445 | 164.605 |
| 0.6951388888888889 | 150.964 |
| 0.6958333333333333 | 141.884 |
| 0.6965277777777777 | 155.509 |
| 0.6972222222222223 | 173.709 |
| 0.6979166666666666 | 178.264 |
| 0.6986111111111111 | 178.264 |
| 0.6993055555555556 | 173.709 |
| 0.7000000000000001 | 173.709 |
| 0.7006944444444444 | 160.056 |
| 0.7013888888888888 | 169.156 |
| 0.7020833333333334 | 169.156 |
| 0.7027777777777778 | 119.235 |
| 0.7034722222222222 | 114.716 |
| 0.7041666666666666 | 114.716 |
| 0.7048611111111112 | 123.758 |
| 0.7055555555555556 | 150.964 |
| 0.7062499999999999 | 146.423 |
| 0.7069444444444444 | 146.423 |
| 0.7076388888888889 | 146.423 |
| 0.7083333333333334 | 146.423 |
| 0.7090277777777777 | 141.884 |
| 0.7097222222222223 | 137.347 |
| 0.7104166666666667 | 132.814 |
| 0.7111111111111111 | 132.814 |
| 0.7118055555555555 | 128.284 |
| 0.7125 | 128.284 |
| 0.7131944444444445 | 128.284 |
| 0.7138888888888889 | 128.284 |
| 0.7145833333333332 | 132.814 |
| 0.7152777777777778 | 132.814 |
| 0.7159722222222222 | 128.284 |
| 0.7166666666666667 | 119.235 |
| 0.717361111111111 | 92.184 |
| 0.7180555555555556 | 87.692 |
| 0.71875 | 83.205 |
| 0.7194444444444444 | 78.722 |
| 0.720138888888889 | 78.722 |
| 0.7208333333333333 | 74.246 |
| 0.7215277777777778 | 74.246 |
| 0.7222222222222222 | 69.775 |
| 0.7229166666666668 | 69.775 |
| 0.7236111111111111 | 65.31 |
| 0.7243055555555555 | 65.31 |
| 0.725 | 65.31 |
| 0.7256944444444445 | 65.31 |
| 0.7263888888888889 | 60.85 |
| 0.7270833333333333 | 60.85 |
| 0.7277777777777777 | 60.85 |
| 0.7284722222222223 | 60.85 |
| 0.7291666666666666 | 60.85 |
| 0.7298611111111111 | 60.85 |
| 0.7305555555555556 | 56.398 |
| 0.7312500000000001 | 60.85 |
| 0.7319444444444444 | 60.85 |
| 0.7326388888888888 | 65.31 |
| 0.7333333333333334 | 65.31 |
| 0.7340277777777778 | 69.775 |
| 0.7347222222222222 | 87.692 |
| 0.7354166666666666 | 92.184 |
| 0.7361111111111112 | 83.205 |
| 0.7368055555555556 | 83.205 |
| 0.7374999999999999 | 87.692 |
| 0.7381944444444444 | 96.682 |
| 0.7388888888888889 | 101.184 |
| 0.7395833333333334 | 101.184 |
| 0.7402777777777777 | 96.682 |
| 0.7409722222222223 | 96.682 |
| 0.7416666666666667 | 96.682 |
| 0.7423611111111111 | 96.682 |
| 0.7430555555555555 | 101.184 |
| 0.74375 | 101.184 |
| 0.7444444444444445 | 110.201 |
| 0.7451388888888889 | 114.716 |
| 0.7458333333333332 | 123.758 |
| 0.7465277777777778 | 128.284 |
| 0.7472222222222222 | 132.814 |
| 0.7479166666666667 | 137.347 |
| 0.748611111111111 | 141.884 |
| 0.7493055555555556 | 146.423 |
| 0.75 | 155.509 |
| 0.7506944444444444 | 155.509 |
| 0.751388888888889 | 164.605 |
| 0.7520833333333333 | 164.605 |
| 0.7527777777777778 | 169.156 |
| 0.7534722222222222 | 169.156 |
| 0.7541666666666668 | 173.709 |
| 0.7548611111111111 | 173.709 |
| 0.7555555555555555 | 169.156 |
| 0.75625 | 173.709 |
| 0.7569444444444445 | 173.709 |
| 0.7576388888888889 | 173.709 |
| 0.7583333333333333 | 178.264 |
| 0.7590277777777777 | 173.709 |
| 0.7597222222222223 | 173.709 |
| 0.7604166666666666 | 169.156 |
| 0.7611111111111111 | 169.156 |
| 0.7618055555555556 | 164.605 |
| 0.7625000000000001 | 164.605 |
| 0.7631944444444444 | 155.509 |
| 0.7638888888888888 | 150.964 |
| 0.7645833333333334 | 146.423 |
| 0.7652777777777778 | 137.347 |
| 0.7659722222222222 | 137.347 |
| 0.7666666666666666 | 128.284 |
| 0.7673611111111112 | 128.284 |
| 0.7680555555555556 | 123.758 |
| 0.7687499999999999 | 119.235 |
| 0.7694444444444444 | 114.716 |
| 0.7701388888888889 | 114.716 |
| 0.7708333333333334 | 114.716 |
| 0.7715277777777777 | 110.201 |
| 0.7722222222222223 | 110.201 |
| 0.7729166666666667 | 105.69 |
| 0.7736111111111111 | 105.69 |
| 0.7743055555555555 | 101.184 |
| 0.775 | 101.184 |
| 0.7756944444444445 | 101.184 |
| 0.7763888888888889 | 96.682 |
| 0.7770833333333332 | 92.184 |
| 0.7777777777777778 | 92.184 |
| 0.7784722222222222 | 87.692 |
| 0.7791666666666667 | 83.205 |
| 0.779861111111111 | 83.205 |
| 0.7805555555555556 | 83.205 |
| 0.78125 | 78.722 |
| 0.7819444444444444 | 78.722 |
| 0.782638888888889 | 74.246 |
| 0.7833333333333333 | 74.246 |
| 0.7840277777777778 | 74.246 |
| 0.7847222222222222 | 74.246 |
| 0.7854166666666668 | 74.246 |
| 0.7861111111111111 | 74.246 |
| 0.7868055555555555 | 69.775 |
| 0.7875 | 69.775 |
| 0.7881944444444445 | 69.775 |
| 0.7888888888888889 | 69.775 |
| 0.7895833333333333 | 65.31 |
| 0.7902777777777777 | 65.31 |
| 0.7909722222222223 | 65.31 |
| 0.7916666666666666 | 65.31 |
| 0.7923611111111111 | 65.31 |
| 0.7930555555555556 | 60.85 |
| 0.7937500000000001 | 60.85 |
| 0.7944444444444444 | 60.85 |
| 0.7951388888888888 | 56.398 |
| 0.7958333333333334 | 56.398 |
| 0.7965277777777778 | 56.398 |
| 0.7972222222222222 | 56.398 |
| 0.7979166666666666 | 51.951 |
| 0.7986111111111112 | 51.951 |
| 0.7993055555555556 | 47.511 |
| 0.7999999999999999 | 47.511 |
| 0.8006944444444444 | 47.511 |
| 0.8013888888888889 | 47.511 |
| 0.8020833333333334 | 43.079 |
| 0.8027777777777777 | 43.079 |
| 0.8034722222222223 | 38.653 |
| 0.8041666666666667 | 38.653 |
| 0.8048611111111111 | 38.653 |
| 0.8055555555555555 | 34.234 |
| 0.80625 | 34.234 |
| 0.8069444444444445 | 29.823 |
| 0.8076388888888889 | 29.823 |
| 0.8083333333333332 | 29.823 |
| 0.8090277777777778 | 29.823 |
| 0.8097222222222222 | 25.419 |
| 0.8104166666666667 | 25.419 |
| 0.811111111111111 | 25.419 |
| 0.8118055555555556 | 25.419 |
| 0.8125 | 21.024 |
| 0.8131944444444444 | 21.024 |
| 0.813888888888889 | 21.024 |
| 0.8145833333333333 | 21.024 |
| 0.8152777777777778 | 21.024 |
| 0.8159722222222222 | 16.636 |
| 0.8166666666666668 | 16.636 |
| 0.8173611111111111 | 16.636 |
| 0.8180555555555555 | 16.636 |
| 0.81875 | 16.636 |
| 0.8194444444444445 | 12.257 |
| 0.8201388888888889 | 12.257 |
| 0.8208333333333333 | 12.257 |
| 0.8215277777777777 | 12.257 |
| 0.8222222222222223 | 12.257 |
| 0.8229166666666666 | 12.257 |
| 0.8236111111111111 | 12.257 |
| 0.8243055555555556 | 12.257 |
| 0.8250000000000001 | 7.887 |
| 0.8256944444444444 | 7.887 |
| 0.8263888888888888 | 7.887 |
| 0.8270833333333334 | 7.887 |
| 0.8277777777777778 | 7.887 |
| 0.8284722222222222 | 7.887 |
| 0.8291666666666666 | 3.525 |
| 0.8298611111111112 | 3.525 |
| 0.8305555555555556 | 3.525 |
| 0.8312499999999999 | 3.525 |
| 0.8319444444444444 | 3.525 |
| 0.8326388888888889 | 3.525 |
| 0.8333333333333334 | 3.525 |
| 0.8340277777777777 | 0 |
| 0.8347222222222223 | 0 |
| 0.8354166666666667 | 0 |
| 0.8361111111111111 | 0 |
| 0.8368055555555555 | 0 |
| 0.8375 | 0 |
| 0.8381944444444445 | 0 |
| 0.8388888888888889 | 0 |
| 0.8395833333333332 | 0 |
| 0.8402777777777778 | 0 |
| 0.8409722222222222 | 0 |
| 0.8416666666666667 | 0 |
| 0.842361111111111 | 0 |
| 0.8430555555555556 | 0 |
| 0.84375 | 0 |
| 0.8444444444444444 | 0 |
| 0.845138888888889 | 0 |
| 0.8458333333333333 | 0 |
| 0.8465277777777778 | 0 |
| 0.8472222222222222 | 0 |
| 0.8479166666666668 | 0 |
| 0.8486111111111111 | 0 |
| 0.8493055555555555 | 0 |
| 0.85 | 0 |
| 0.8506944444444445 | 0 |
| 0.8513888888888889 | 0 |
| 0.8520833333333333 | 0 |
| 0.8527777777777777 | 0 |
| 0.8534722222222223 | 0 |
| 0.8541666666666666 | 0 |
| 0.8548611111111111 | 0 |
| 0.8555555555555556 | 0 |
| 0.8562500000000001 | 0 |
| 0.8569444444444444 | 0 |
| 0.8576388888888888 | 0 |
| 0.8583333333333334 | 0 |
| 0.8590277777777778 | 0 |
| 0.8597222222222222 | 0 |
| 0.8604166666666666 | 0 |
| 0.8611111111111112 | 0 |
| 0.8618055555555556 | 0 |
| 0.8624999999999999 | 0 |
| 0.8631944444444444 | 0 |
| 0.8638888888888889 | 0 |
| 0.8645833333333334 | 0 |
| 0.8652777777777777 | 0 |
| 0.8659722222222223 | 0 |
| 0.8666666666666667 | 0 |
| 0.8673611111111111 | 0 |
| 0.8680555555555555 | 0 |
| 0.86875 | 0 |
| 0.8694444444444445 | 0 |
| 0.8701388888888889 | 0 |
| 0.8708333333333332 | 0 |
| 0.8715277777777778 | 0 |
| 0.8722222222222222 | 0 |
| 0.8729166666666667 | 0 |
| 0.873611111111111 | 0 |
| 0.8743055555555556 | 0 |
| 0.875 | 0 |
| 0.8756944444444444 | 0 |
| 0.876388888888889 | 0 |
| 0.8770833333333333 | 0 |
| 0.8777777777777778 | 0 |
| 0.8784722222222222 | 0 |
| 0.8791666666666668 | 0 |
| 0.8798611111111111 | 0 |
| 0.8805555555555555 | 0 |
| 0.88125 | 0 |
| 0.8819444444444445 | 0 |
| 0.8826388888888889 | 0 |
| 0.8833333333333333 | 0 |
| 0.8840277777777777 | 0 |
| 0.8847222222222223 | 0 |
| 0.8854166666666666 | 0 |
| 0.8861111111111111 | 0 |
| 0.8868055555555556 | 0 |
| 0.8875000000000001 | 0 |
| 0.8881944444444444 | 0 |
| 0.8888888888888888 | 0 |
| 0.8895833333333334 | 0 |
| 0.8902777777777778 | 0 |
| 0.8909722222222222 | 0 |
| 0.8916666666666666 | 0 |
| 0.8923611111111112 | 0 |
| 0.8930555555555556 | 0 |
| 0.8937499999999999 | 0 |
| 0.8944444444444444 | 0 |
| 0.8951388888888889 | 0 |
| 0.8958333333333334 | 0 |
| 0.8965277777777777 | 0 |
| 0.8972222222222223 | 0 |
| 0.8979166666666667 | 0 |
| 0.8986111111111111 | 0 |
| 0.8993055555555555 | 0 |
| 0.9 | 0 |
| 0.9006944444444445 | 0 |
| 0.9013888888888889 | 0 |
| 0.9020833333333332 | 0 |
| 0.9027777777777778 | 0 |
| 0.9034722222222222 | 0 |
| 0.9041666666666667 | 0 |
| 0.904861111111111 | 0 |
| 0.9055555555555556 | 0 |
| 0.90625 | 0 |
| 0.9069444444444444 | 0 |
| 0.907638888888889 | 0 |
| 0.9083333333333333 | 0 |
| 0.9090277777777778 | 0 |
| 0.9097222222222222 | 0 |
| 0.9104166666666668 | 0 |
| 0.9111111111111111 | 0 |
| 0.9118055555555555 | 0 |
| 0.9125 | 0 |
| 0.9131944444444445 | 0 |
| 0.9138888888888889 | 0 |
| 0.9145833333333333 | 0 |
| 0.9152777777777777 | 0 |
| 0.9159722222222223 | 0 |
| 0.9166666666666666 | 0 |
| 0.9173611111111111 | 0 |
| 0.9180555555555556 | 0 |
| 0.9187500000000001 | 0 |
| 0.9194444444444444 | 0 |
| 0.9201388888888888 | 0 |
| 0.9208333333333334 | 0 |
| 0.9215277777777778 | 0 |
| 0.9222222222222222 | 0 |
| 0.9229166666666666 | 0 |
| 0.9236111111111112 | 0 |
| 0.9243055555555556 | 0 |
| 0.9249999999999999 | 0 |
| 0.9256944444444444 | 0 |
| 0.9263888888888889 | 0 |
| 0.9270833333333334 | 0 |
| 0.9277777777777777 | 0 |
| 0.9284722222222223 | 0 |
| 0.9291666666666667 | 0 |
| 0.9298611111111111 | 0 |
| 0.9305555555555555 | 0 |
| 0.93125 | 0 |
| 0.9319444444444445 | 0 |
| 0.9326388888888889 | 0 |
| 0.9333333333333332 | 0 |
| 0.9340277777777778 | 0 |
| 0.9347222222222222 | 0 |
| 0.9354166666666667 | 0 |
| 0.936111111111111 | 0 |
| 0.9368055555555556 | 0 |
| 0.9375 | 0 |
| 0.9381944444444444 | 0 |
| 0.938888888888889 | 0 |
| 0.9395833333333333 | 0 |
| 0.9402777777777778 | 0 |
| 0.9409722222222222 | 0 |
| 0.9416666666666668 | 0 |
| 0.9423611111111111 | 0 |
| 0.9430555555555555 | 0 |
| 0.94375 | 0 |
| 0.9444444444444445 | 0 |
| 0.9451388888888889 | 0 |
| 0.9458333333333333 | 0 |
| 0.9465277777777777 | 0 |
| 0.9472222222222223 | 0 |
| 0.9479166666666666 | 0 |
| 0.9486111111111111 | 0 |
| 0.9493055555555556 | 0 |
| 0.9500000000000001 | 0 |
| 0.9506944444444444 | 0 |
| 0.9513888888888888 | 0 |
| 0.9520833333333334 | 0 |
| 0.9527777777777778 | 0 |
| 0.9534722222222222 | 0 |
| 0.9541666666666666 | 0 |
| 0.9548611111111112 | 0 |
| 0.9555555555555556 | 0 |
| 0.9562499999999999 | 0 |
| 0.9569444444444444 | 0 |
| 0.9576388888888889 | 0 |
| 0.9583333333333334 | 0 |
| 0.9590277777777777 | 0 |
| 0.9597222222222223 | 0 |
| 0.9604166666666667 | 0 |
| 0.9611111111111111 | 0 |
| 0.9618055555555555 | 0 |
| 0.9625 | 0 |
| 0.9631944444444445 | 0 |
| 0.9638888888888889 | 0 |
| 0.9645833333333332 | 0 |
| 0.9652777777777778 | 0 |
| 0.9659722222222222 | 0 |
| 0.9666666666666667 | 0 |
| 0.967361111111111 | 0 |
| 0.9680555555555556 | 0 |
| 0.96875 | 0 |
| 0.9694444444444444 | 0 |
| 0.970138888888889 | 0 |
| 0.9708333333333333 | 0 |
| 0.9715277777777778 | 0 |
| 0.9722222222222222 | 0 |
| 0.9729166666666668 | 0 |
| 0.9736111111111111 | 0 |
| 0.9743055555555555 | 0 |
| 0.975 | 0 |
| 0.9756944444444445 | 0 |
| 0.9763888888888889 | 0 |
| 0.9770833333333333 | 0 |
| 0.9777777777777777 | 0 |
| 0.9784722222222223 | 0 |
| 0.9791666666666666 | 0 |
| 0.9798611111111111 | 0 |
| 0.9805555555555556 | 0 |
| 0.9812500000000001 | 0 |
| 0.9819444444444444 | 0 |
| 0.9826388888888888 | 0 |
| 0.9833333333333334 | 0 |
| 0.9840277777777778 | 0 |
| 0.9847222222222222 | 0 |
| 0.9854166666666666 | 0 |
| 0.9861111111111112 | 0 |
| 0.9868055555555556 | 0 |
| 0.9874999999999999 | 0 |
| 0.9881944444444444 | 0 |
| 0.9888888888888889 | 0 |
| 0.9895833333333334 | 0 |
| 0.9902777777777777 | 0 |
| 0.9909722222222223 | 0 |
| 0.9916666666666667 | 0 |
| 0.9923611111111111 | 0 |
| 0.9930555555555555 | 0 |
| 0.99375 | 0 |
| 0.9944444444444445 | 0 |
| 0.9951388888888889 | 0 |
| 0.9958333333333332 | 0 |
| 0.9965277777777778 | 0 |
| 0.9972222222222222 | 0 |
| 0.9979166666666667 | 0 |
| 0.998611111111111 | 0 |
| 0.9993055555555556 | 0 |